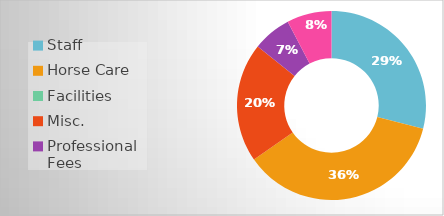
| Category | Series 0 |
|---|---|
| Staff | 13600 |
| Horse Care | 17100 |
| Facilities | 0 |
| Misc. | 9600 |
| Professional Fees | 3100 |
| Insurance | 3600 |